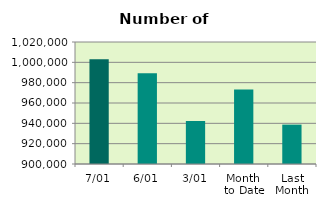
| Category | Series 0 |
|---|---|
| 7/01 | 1003042 |
| 6/01 | 989174 |
| 3/01 | 942368 |
| Month 
to Date | 973244.5 |
| Last
Month | 938735.9 |